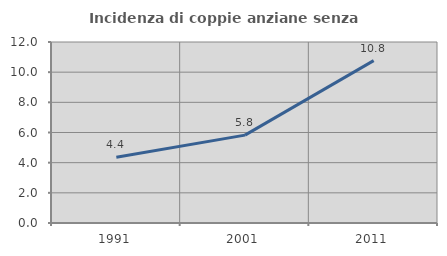
| Category | Incidenza di coppie anziane senza figli  |
|---|---|
| 1991.0 | 4.362 |
| 2001.0 | 5.825 |
| 2011.0 | 10.766 |